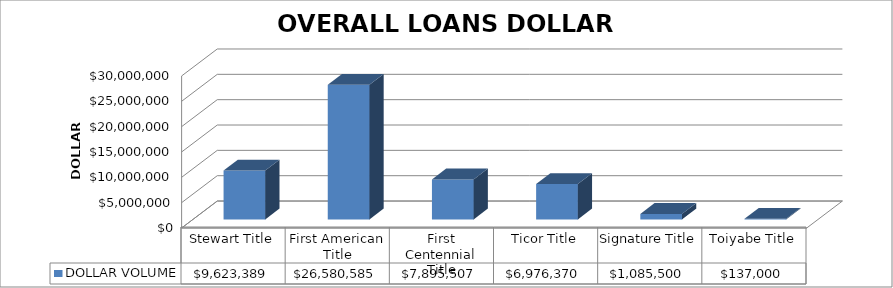
| Category | DOLLAR VOLUME |
|---|---|
| Stewart Title | 9623389 |
| First American Title | 26580585 |
| First Centennial Title | 7895507 |
| Ticor Title | 6976370 |
| Signature Title | 1085500 |
| Toiyabe Title | 137000 |